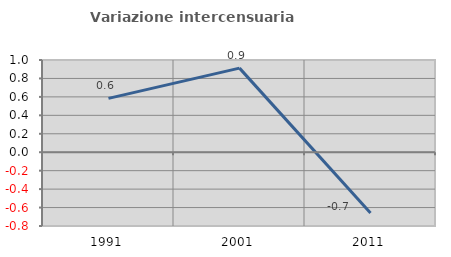
| Category | Variazione intercensuaria annua |
|---|---|
| 1991.0 | 0.584 |
| 2001.0 | 0.912 |
| 2011.0 | -0.66 |